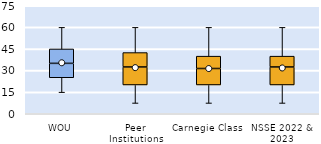
| Category | 25th | 50th | 75th |
|---|---|---|---|
| WOU | 25 | 10 | 10 |
| Peer Institutions | 20 | 12.5 | 10 |
| Carnegie Class | 20 | 11.429 | 8.571 |
| NSSE 2022 & 2023 | 20 | 12.5 | 7.5 |